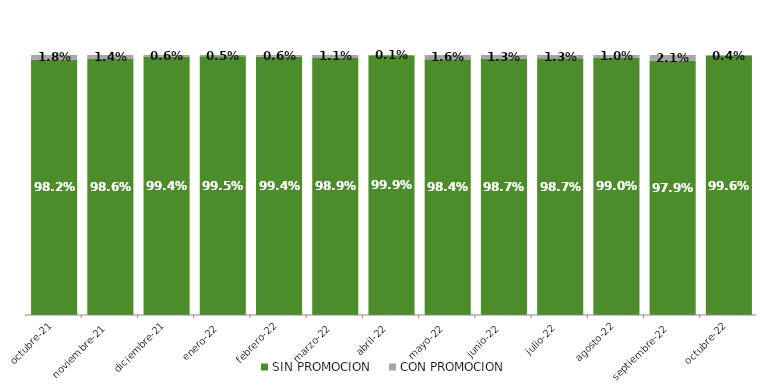
| Category | SIN PROMOCION   | CON PROMOCION   |
|---|---|---|
| 2021-10-01 | 0.982 | 0.018 |
| 2021-11-01 | 0.986 | 0.014 |
| 2021-12-01 | 0.994 | 0.006 |
| 2022-01-01 | 0.995 | 0.005 |
| 2022-02-01 | 0.994 | 0.006 |
| 2022-03-01 | 0.989 | 0.011 |
| 2022-04-01 | 0.999 | 0.001 |
| 2022-05-01 | 0.984 | 0.016 |
| 2022-06-01 | 0.987 | 0.013 |
| 2022-07-01 | 0.987 | 0.013 |
| 2022-08-01 | 0.99 | 0.01 |
| 2022-09-01 | 0.979 | 0.021 |
| 2022-10-01 | 0.996 | 0.004 |